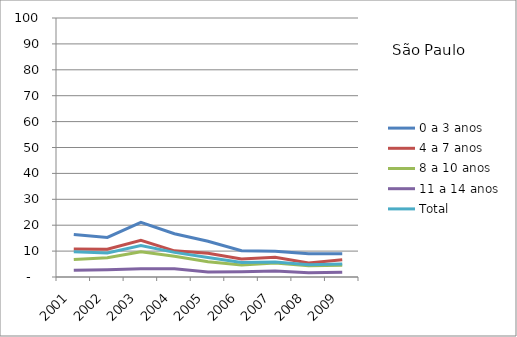
| Category | 0 a 3 anos | 4 a 7 anos | 8 a 10 anos | 11 a 14 anos | Total |
|---|---|---|---|---|---|
| 2001.0 | 16.41 | 10.77 | 6.76 | 2.57 | 9.72 |
| 2002.0 | 15.28 | 10.69 | 7.4 | 2.83 | 9.3 |
| 2003.0 | 21.08 | 14.18 | 9.76 | 3.21 | 12.13 |
| 2004.0 | 16.72 | 10.09 | 7.98 | 3.17 | 9.51 |
| 2005.0 | 13.79 | 9.16 | 5.91 | 1.89 | 7.52 |
| 2006.0 | 10.11 | 6.93 | 4.64 | 2.05 | 5.62 |
| 2007.0 | 9.9 | 7.61 | 5.43 | 2.34 | 5.82 |
| 2008.0 | 9 | 5.44 | 4.32 | 1.6 | 4.7 |
| 2009.0 | 9.02 | 6.67 | 4.52 | 1.88 | 5.06 |